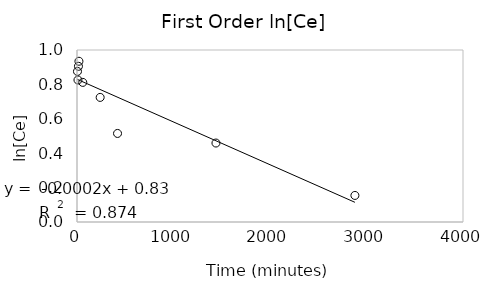
| Category | First Order ln[Ce] |
|---|---|
| 5.0 | 0.876 |
| 10.0 | 0.826 |
| 15.0 | 0.905 |
| 20.0 | 0.935 |
| 60.0 | 0.812 |
| 240.0 | 0.724 |
| 420.0 | 0.515 |
| 1440.0 | 0.459 |
| 2880.0 | 0.154 |